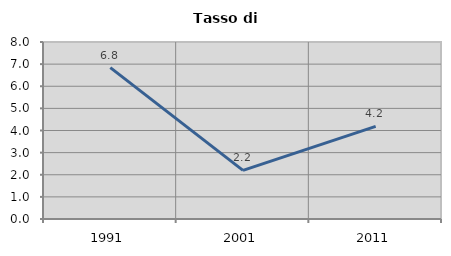
| Category | Tasso di disoccupazione   |
|---|---|
| 1991.0 | 6.844 |
| 2001.0 | 2.199 |
| 2011.0 | 4.19 |